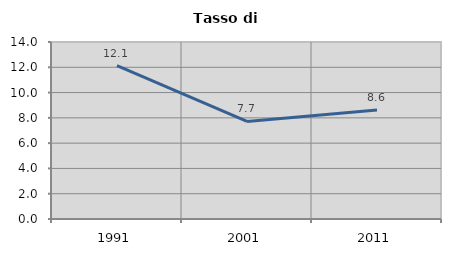
| Category | Tasso di disoccupazione   |
|---|---|
| 1991.0 | 12.132 |
| 2001.0 | 7.718 |
| 2011.0 | 8.612 |